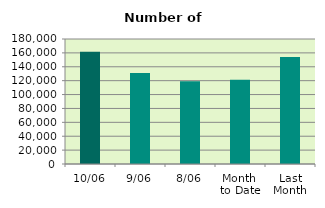
| Category | Series 0 |
|---|---|
| 10/06 | 161540 |
| 9/06 | 130894 |
| 8/06 | 119318 |
| Month 
to Date | 121433 |
| Last
Month | 154240.182 |